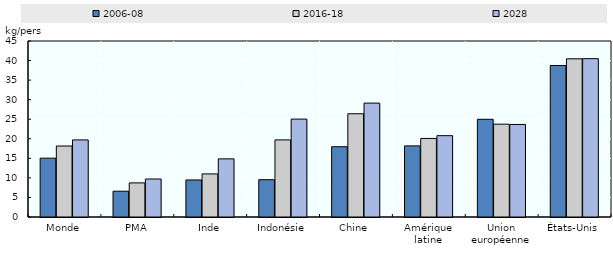
| Category | 2006-08 | 2016-18 | 2028 |
|---|---|---|---|
| Monde | 15.041 | 18.152 | 19.712 |
| PMA | 6.595 | 8.717 | 9.717 |
| Inde | 9.469 | 11.014 | 14.865 |
| Indonésie | 9.538 | 19.716 | 25.035 |
| Chine | 17.971 | 26.398 | 29.12 |
| Amérique latine | 18.182 | 20.086 | 20.797 |
| Union européenne | 24.978 | 23.735 | 23.662 |
| États-Unis | 38.735 | 40.45 | 40.487 |